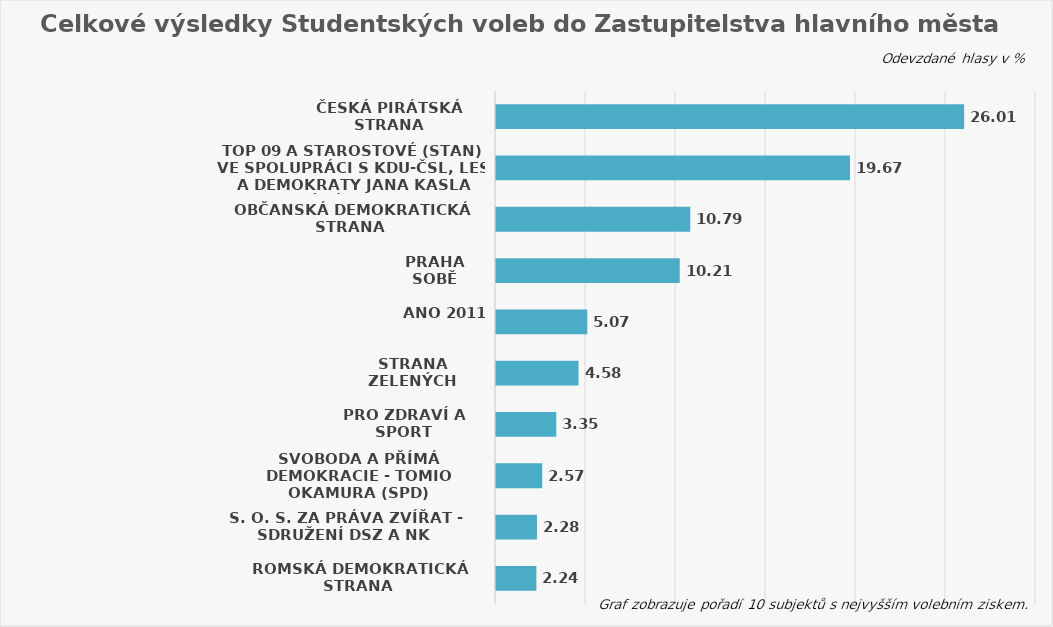
| Category | Series 0 |
|---|---|
| Česká pirátská strana | 26.008 |
| TOP 09 a Starostové (STAN) ve spolupráci s KDU-ČSL, LES a Demokraty Jana Kasla -"Spojené síly pro Prahu" | 19.668 |
| Občanská demokratická strana | 10.793 |
| PRAHA SOBĚ | 10.208 |
| ANO 2011 | 5.072 |
| Strana zelených | 4.584 |
| PRO Zdraví a Sport | 3.349 |
| Svoboda a přímá demokracie - Tomio Okamura (SPD) | 2.568 |
| S. O. S. ZA PRÁVA ZVÍŘAT - sdružení DSZ a NK | 2.276 |
| Romská demokratická strana | 2.243 |